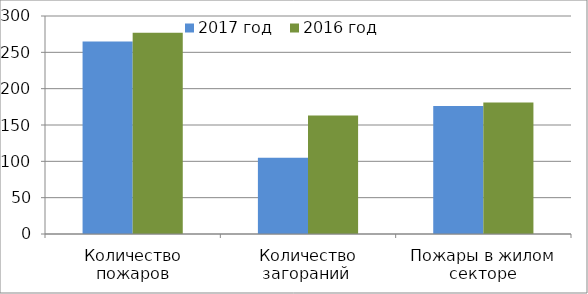
| Category | 2017 год | 2016 год |
|---|---|---|
| Количество пожаров | 265 | 277 |
| Количество загораний  | 105 | 163 |
| Пожары в жилом секторе | 176 | 181 |